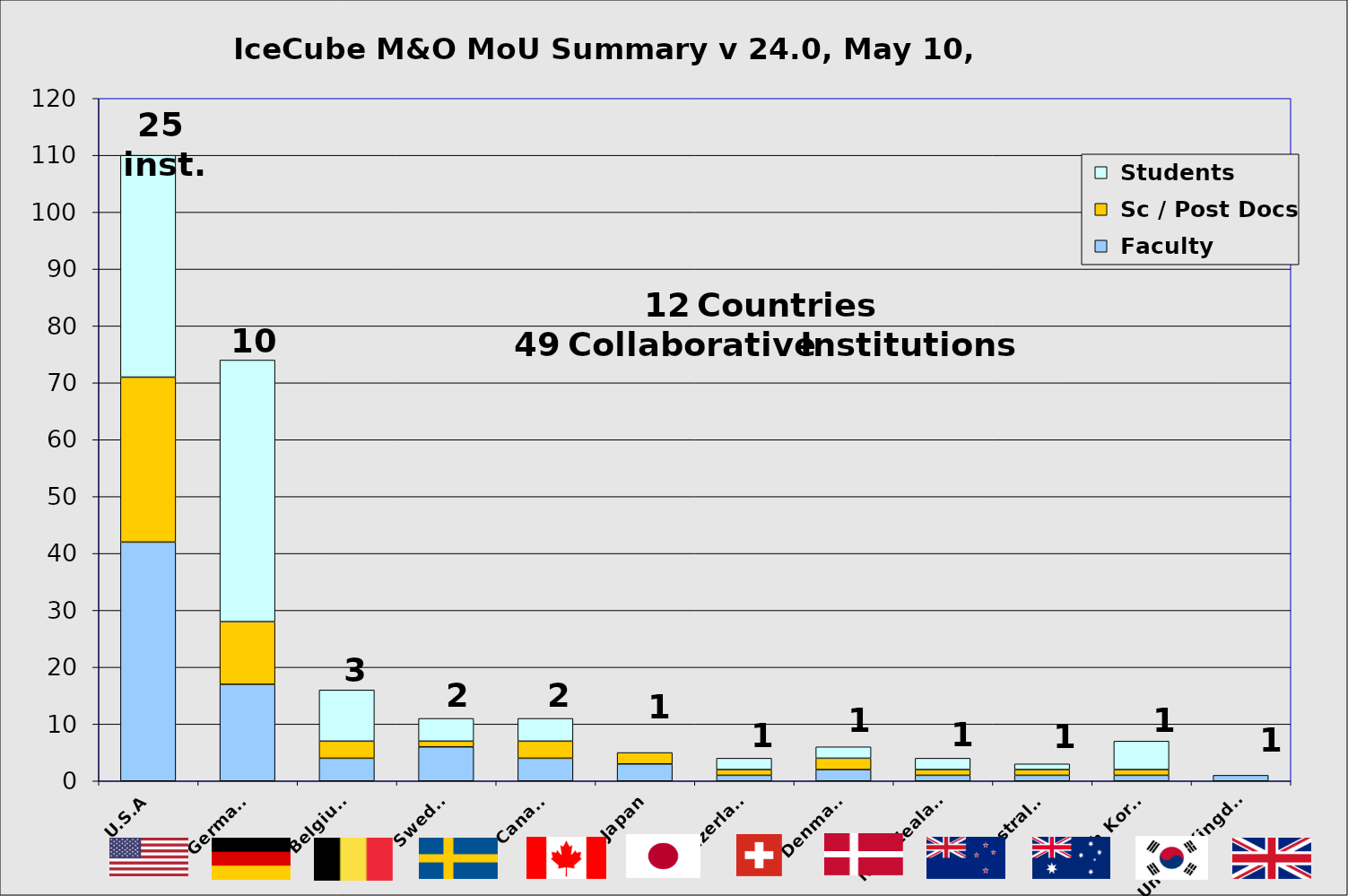
| Category |  Faculty |  Sc / Post Docs |  Students |
|---|---|---|---|
| U.S.A | 42 | 29 | 39 |
| Germany | 17 | 11 | 46 |
| Belgium | 4 | 3 | 9 |
| Sweden | 6 | 1 | 4 |
| Canada | 4 | 3 | 4 |
| Japan | 3 | 2 | 0 |
| Switzerland | 1 | 1 | 2 |
| Denmark | 2 | 2 | 2 |
| New Zealand | 1 | 1 | 2 |
| Australia | 1 | 1 | 1 |
| South Korea | 1 | 1 | 5 |
| United Kingdom | 1 | 0 | 0 |